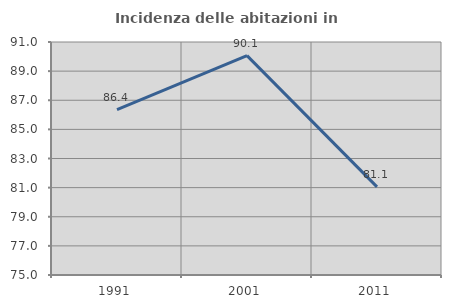
| Category | Incidenza delle abitazioni in proprietà  |
|---|---|
| 1991.0 | 86.353 |
| 2001.0 | 90.065 |
| 2011.0 | 81.054 |